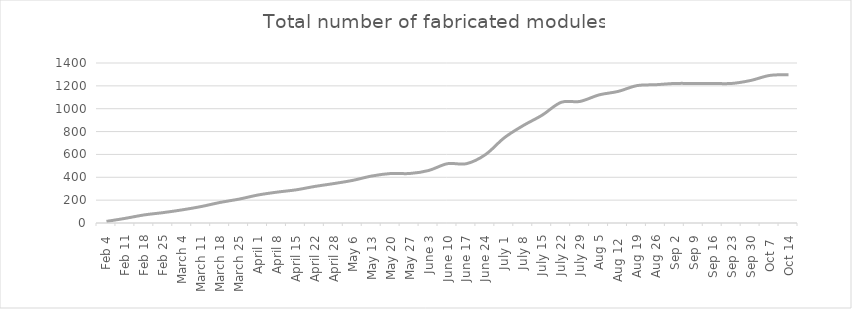
| Category | Series 2 |
|---|---|
| Feb 4 | 14 |
| Feb 11 | 41 |
| Feb 18 | 71 |
| Feb 25 | 91 |
| March 4 | 115 |
| March 11 | 144 |
| March 18 | 180 |
| March 25 | 209 |
| April 1 | 245 |
| April 8 | 270 |
| April 15 | 290 |
| April 22 | 320 |
| April 28 | 345 |
| May 6 | 373 |
| May 13 | 411 |
| May 20 | 433 |
| May 27 | 433 |
| June 3 | 459 |
| June 10 | 519 |
| June 17 | 519 |
| June 24 | 598 |
| July 1 | 746 |
| July 8 | 853 |
| July 15 | 944 |
| July 22 | 1056 |
| July 29 | 1064 |
| Aug 5 | 1121 |
| Aug 12  | 1151 |
| Aug 19 | 1202 |
| Aug 26 | 1210 |
| Sep 2 | 1221 |
| Sep 9 | 1221 |
| Sep 16 | 1221 |
| Sep 23 | 1221 |
| Sep 30 | 1247 |
| Oct 7  | 1291 |
| Oct 14 | 1298 |